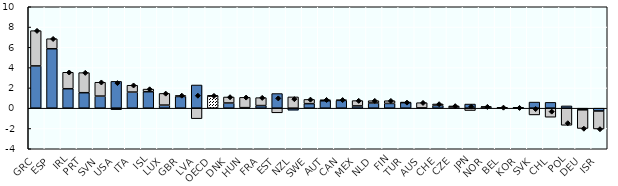
| Category | Cyclical | Structural |
|---|---|---|
| GRC | 4.168 | 3.476 |
| ESP | 5.86 | 0.989 |
| IRL | 1.918 | 1.624 |
| PRT | 1.527 | 1.979 |
| SVN | 1.193 | 1.366 |
| USA | 2.644 | -0.148 |
| ITA | 1.589 | 0.674 |
| ISL | 1.624 | 0.259 |
| LUX | 0.305 | 1.152 |
| GBR | 1.152 | 0.103 |
| LVA | 2.287 | -1.034 |
| OECD | 1.209 | 0.026 |
| DNK | 0.511 | 0.592 |
| HUN | 0.052 | 1.017 |
| FRA | 0.257 | 0.782 |
| EST | 1.443 | -0.456 |
| NZL | -0.198 | 1.111 |
| SWE | 0.449 | 0.416 |
| AUT | 0.73 | 0.105 |
| CAN | 0.77 | 0.052 |
| MEX | 0.223 | 0.527 |
| NLD | 0.516 | 0.221 |
| FIN | 0.47 | 0.267 |
| TUR | 0.555 | 0.017 |
| AUS | 0.028 | 0.515 |
| CHE | 0.273 | 0.141 |
| CZE | 0.116 | 0.104 |
| JPN | 0.408 | -0.231 |
| NOR | 0.108 | 0.042 |
| BEL | -0.012 | 0.088 |
| KOR | 0.032 | 0.017 |
| SVK | 0.601 | -0.664 |
| CHL | 0.572 | -0.888 |
| POL | 0.224 | -1.686 |
| DEU | -0.162 | -1.838 |
| ISR | -0.275 | -1.774 |